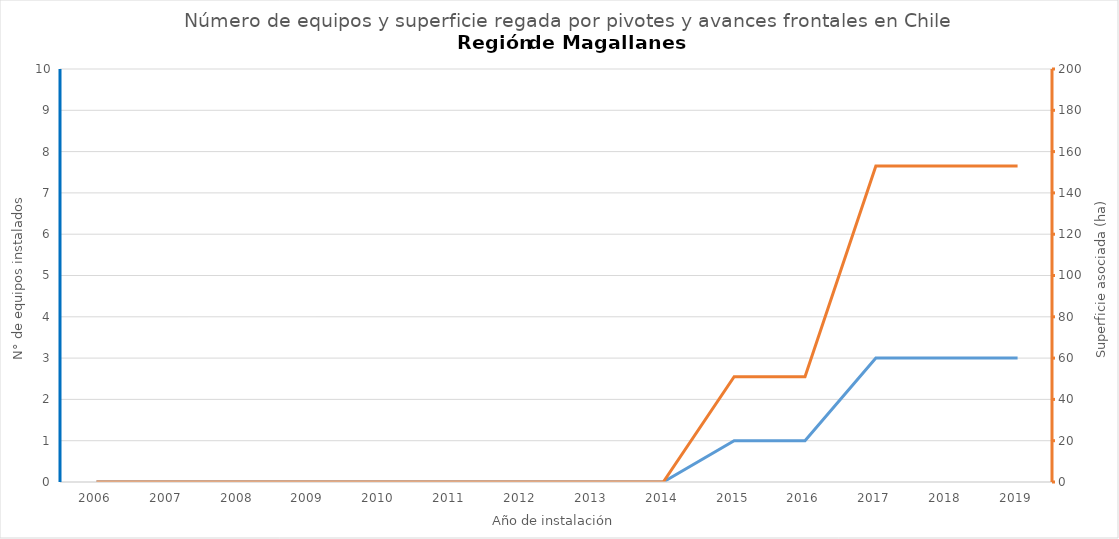
| Category | N° |
|---|---|
| 2006.0 | 0 |
| 2007.0 | 0 |
| 2008.0 | 0 |
| 2009.0 | 0 |
| 2010.0 | 0 |
| 2011.0 | 0 |
| 2012.0 | 0 |
| 2013.0 | 0 |
| 2014.0 | 0 |
| 2015.0 | 1 |
| 2016.0 | 1 |
| 2017.0 | 3 |
| 2018.0 | 3 |
| 2019.0 | 3 |